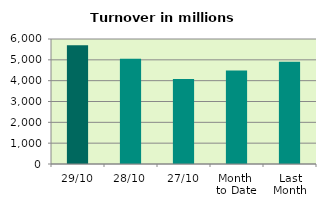
| Category | Series 0 |
|---|---|
| 29/10 | 5704.244 |
| 28/10 | 5046.91 |
| 27/10 | 4084.857 |
| Month 
to Date | 4491.272 |
| Last
Month | 4910.879 |